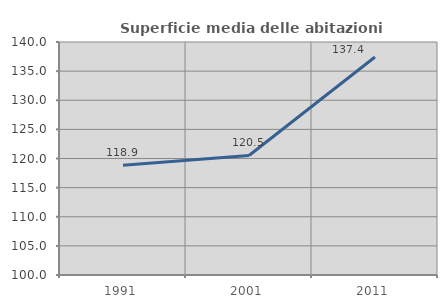
| Category | Superficie media delle abitazioni occupate |
|---|---|
| 1991.0 | 118.854 |
| 2001.0 | 120.515 |
| 2011.0 | 137.417 |